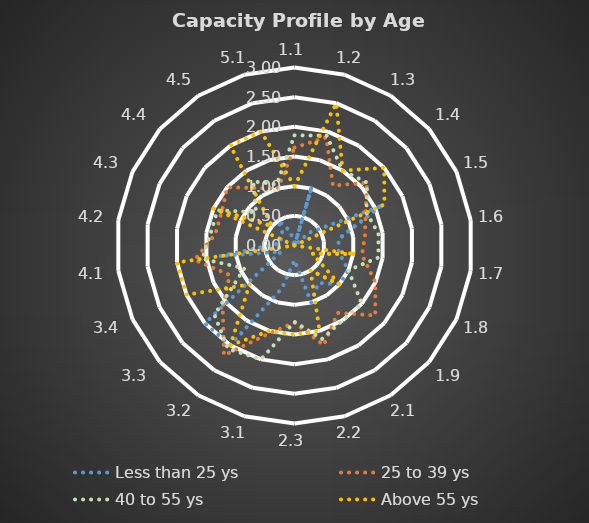
| Category | Less than 25 ys | 25 to 39 ys | 40 to 55 ys | Above 55 ys |
|---|---|---|---|---|
| 1.1 | 0 | 1.65 | 1.857 | 1 |
| 1.2 | 1 | 1.9 | 1.929 | 2.5 |
| 1.3 | 0 | 1.2 | 1.5 | 1.5 |
| 1.4 | 0.333 | 1.617 | 1.619 | 2 |
| 1.5 | 1.583 | 1.317 | 1.333 | 1.667 |
| 1.6 | 0.75 | 1.2 | 1.429 | 0 |
| 1.7 | 0.75 | 1.15 | 1.429 | 1 |
| 1.8 | 1 | 1.5 | 1 | 0.333 |
| 1.9 | 1 | 1.8 | 1.5 | 1 |
| 2.1 | 0.75 | 1.35 | 1.5 | 0.5 |
| 2.2 | 1 | 1.75 | 1.643 | 1.5 |
| 2.3 | 0.25 | 1.3 | 1.286 | 1.5 |
| 3.1 | 0.75 | 1.55 | 2 | 1.5 |
| 3.2 | 2 | 2.2 | 2.071 | 2 |
| 3.3 | 2 | 1.6 | 1.786 | 1 |
| 3.4 | 0.25 | 1.2 | 0.929 | 2 |
| 4.1 | 1.25 | 1.7 | 1.571 | 2 |
| 4.2 | 0.25 | 1.35 | 1.429 | 0 |
| 4.3 | 0.25 | 1.35 | 1.429 | 1.5 |
| 4.4 | 0.25 | 1.5 | 0.857 | 0.5 |
| 4.5 | 0.5 | 1.15 | 1.286 | 2 |
| 5.1 | 0.25 | 1 | 1.071 | 2 |